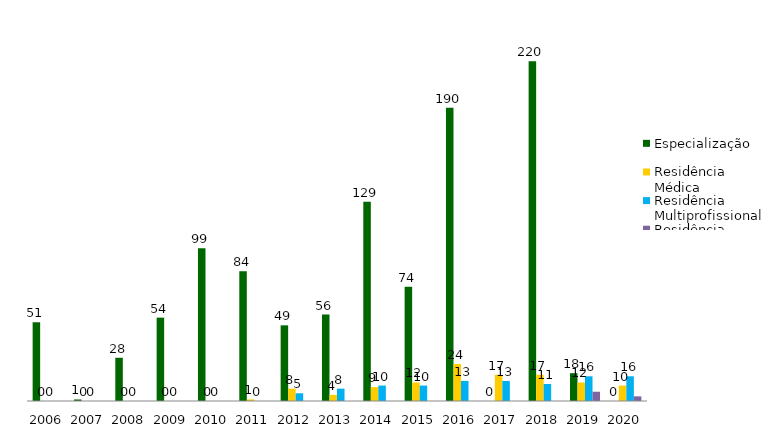
| Category | Especialização | Residência Médica | Residência Multiprofissional | Residência Uniprofissional |
|---|---|---|---|---|
| 2006.0 | 51 | 0 | 0 | 0 |
| 2007.0 | 1 | 0 | 0 | 0 |
| 2008.0 | 28 | 0 | 0 | 0 |
| 2009.0 | 54 | 0 | 0 | 0 |
| 2010.0 | 99 | 0 | 0 | 0 |
| 2011.0 | 84 | 1 | 0 | 0 |
| 2012.0 | 49 | 8 | 5 | 0 |
| 2013.0 | 56 | 4 | 8 | 0 |
| 2014.0 | 129 | 9 | 10 | 0 |
| 2015.0 | 74 | 12 | 10 | 0 |
| 2016.0 | 190 | 24 | 13 | 0 |
| 2017.0 | 0 | 17 | 13 | 0 |
| 2018.0 | 220 | 17 | 11 | 0 |
| 2019.0 | 18 | 12 | 16 | 6 |
| 2020.0 | 0 | 10 | 16 | 3 |